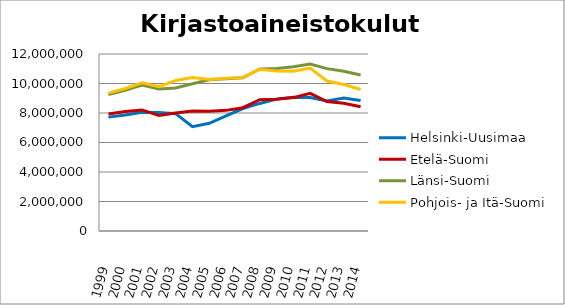
| Category | Helsinki-Uusimaa | Etelä-Suomi | Länsi-Suomi | Pohjois- ja Itä-Suomi |
|---|---|---|---|---|
| 1999.0 | 7720883.04 | 7935126.08 | 9246339.81 | 9349225.75 |
| 2000.0 | 7860935.48 | 8102223.03 | 9530925.72 | 9664514.91 |
| 2001.0 | 8046440.71 | 8207578.32 | 9897313.86 | 10042833.42 |
| 2002.0 | 8030444 | 7825618 | 9630769 | 9789574 |
| 2003.0 | 7956179 | 7995926 | 9696964 | 10200994 |
| 2004.0 | 7070039 | 8132769 | 9980992 | 10411796 |
| 2005.0 | 7299403 | 8118743 | 10255378 | 10270681 |
| 2006.0 | 7810038 | 8178837 | 10317931 | 10356841 |
| 2007.0 | 8304101 | 8357808 | 10381899 | 10411428 |
| 2008.0 | 8648928 | 8905465.88 | 10990797.91 | 10959771.41 |
| 2009.0 | 8940103.28 | 8936617.28 | 11022635.43 | 10845296.47 |
| 2010.0 | 9063039.06 | 9045064.47 | 11134807.95 | 10828718.31 |
| 2011.0 | 9042637.44 | 9335121.39 | 11321926.7 | 11050750.32 |
| 2012.0 | 8811734.37 | 8771646.41 | 11007019.77 | 10165531.33 |
| 2013.0 | 9023232.97 | 8663513.99 | 10823905.46 | 9926750.79 |
| 2014.0 | 8852630.73 | 8423140.88 | 10571878.57 | 9595682.66 |